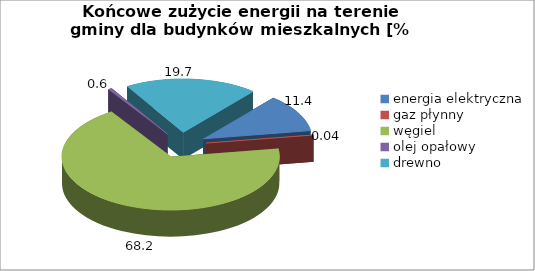
| Category | 11,4 0,04 68,2 0,6 19,7 |
|---|---|
| energia elektryczna | 11.422 |
| gaz płynny | 0.038 |
| węgiel | 68.245 |
| olej opałowy | 0.58 |
| drewno | 19.715 |